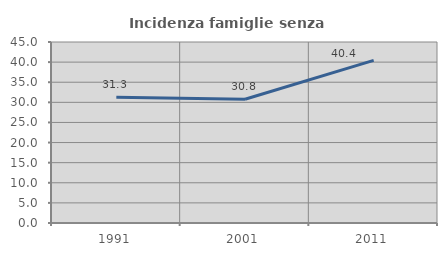
| Category | Incidenza famiglie senza nuclei |
|---|---|
| 1991.0 | 31.29 |
| 2001.0 | 30.752 |
| 2011.0 | 40.421 |